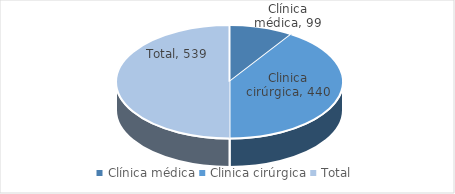
| Category | Series 0 |
|---|---|
| Clínica médica | 99 |
| Clinica cirúrgica | 440 |
| Total | 539 |